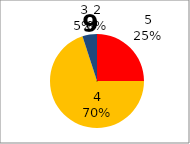
| Category | Series 0 |
|---|---|
| 5.0 | 5 |
| 4.0 | 14 |
| 3.0 | 1 |
| 2.0 | 0 |